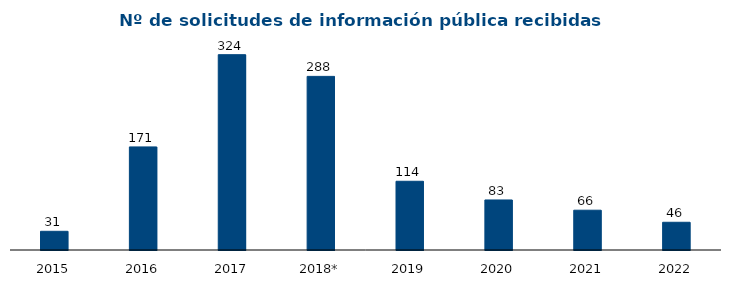
| Category | Series 1 |
|---|---|
| 2015 | 31 |
| 2016 | 171 |
| 2017 | 324 |
| 2018* | 288 |
| 2019 | 114 |
| 2020 | 83 |
| 2021 | 66 |
| 2022 | 46 |